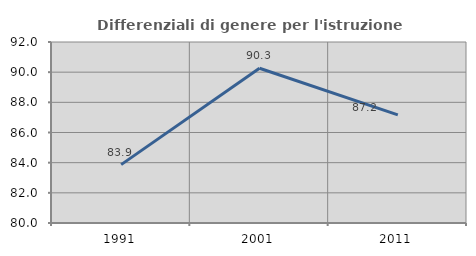
| Category | Differenziali di genere per l'istruzione superiore |
|---|---|
| 1991.0 | 83.869 |
| 2001.0 | 90.259 |
| 2011.0 | 87.174 |